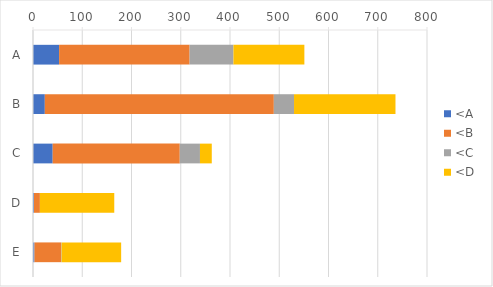
| Category | <A | <B | <C | <D |
|---|---|---|---|---|
| A | 53 | 265 | 89 | 144 |
| B | 24 | 465 | 41 | 206 |
| C | 40 | 258 | 41 | 24 |
| D | 2 | 12 | 0 | 151 |
| E | 3 | 54 | 1 | 121 |